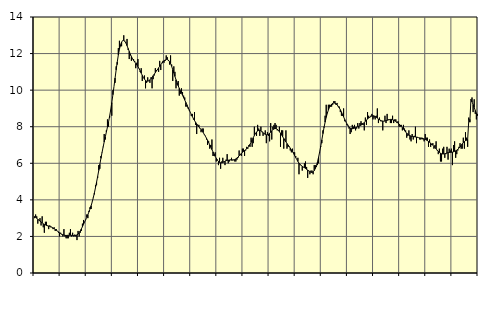
| Category | Piggar | Series 1 |
|---|---|---|
| nan | 3 | 3.09 |
| 87.0 | 3.2 | 3.04 |
| 87.0 | 3.1 | 3 |
| 87.0 | 2.7 | 2.94 |
| 87.0 | 2.9 | 2.89 |
| 87.0 | 3 | 2.84 |
| 87.0 | 2.6 | 2.79 |
| 87.0 | 3.1 | 2.74 |
| 87.0 | 2.5 | 2.69 |
| 87.0 | 2.2 | 2.66 |
| 87.0 | 2.8 | 2.63 |
| 87.0 | 2.8 | 2.6 |
| nan | 2.6 | 2.58 |
| 88.0 | 2.4 | 2.57 |
| 88.0 | 2.6 | 2.55 |
| 88.0 | 2.5 | 2.53 |
| 88.0 | 2.5 | 2.5 |
| 88.0 | 2.4 | 2.46 |
| 88.0 | 2.5 | 2.42 |
| 88.0 | 2.3 | 2.38 |
| 88.0 | 2.4 | 2.33 |
| 88.0 | 2.3 | 2.29 |
| 88.0 | 2.2 | 2.25 |
| 88.0 | 2 | 2.2 |
| nan | 2.2 | 2.16 |
| 89.0 | 2.1 | 2.12 |
| 89.0 | 2 | 2.09 |
| 89.0 | 2.4 | 2.07 |
| 89.0 | 2 | 2.06 |
| 89.0 | 1.9 | 2.05 |
| 89.0 | 1.9 | 2.06 |
| 89.0 | 1.9 | 2.06 |
| 89.0 | 2.2 | 2.06 |
| 89.0 | 2.4 | 2.06 |
| 89.0 | 2 | 2.06 |
| 89.0 | 2.2 | 2.05 |
| nan | 2 | 2.05 |
| 90.0 | 2.1 | 2.04 |
| 90.0 | 2 | 2.06 |
| 90.0 | 1.8 | 2.08 |
| 90.0 | 2.3 | 2.13 |
| 90.0 | 2 | 2.2 |
| 90.0 | 2.2 | 2.3 |
| 90.0 | 2.3 | 2.41 |
| 90.0 | 2.7 | 2.53 |
| 90.0 | 2.9 | 2.66 |
| 90.0 | 2.8 | 2.79 |
| 90.0 | 2.9 | 2.92 |
| nan | 3.2 | 3.05 |
| 91.0 | 3 | 3.19 |
| 91.0 | 3.4 | 3.34 |
| 91.0 | 3.6 | 3.5 |
| 91.0 | 3.5 | 3.68 |
| 91.0 | 3.9 | 3.89 |
| 91.0 | 4.1 | 4.12 |
| 91.0 | 4.3 | 4.38 |
| 91.0 | 4.8 | 4.67 |
| 91.0 | 4.8 | 4.97 |
| 91.0 | 5.2 | 5.28 |
| 91.0 | 5.9 | 5.61 |
| nan | 5.7 | 5.94 |
| 92.0 | 6.4 | 6.27 |
| 92.0 | 6.6 | 6.58 |
| 92.0 | 6.9 | 6.88 |
| 92.0 | 7.6 | 7.17 |
| 92.0 | 7.3 | 7.44 |
| 92.0 | 7.8 | 7.71 |
| 92.0 | 8.4 | 7.98 |
| 92.0 | 8 | 8.26 |
| 92.0 | 8.5 | 8.58 |
| 92.0 | 8.9 | 8.93 |
| 92.0 | 8.6 | 9.32 |
| nan | 10 | 9.75 |
| 93.0 | 10.2 | 10.2 |
| 93.0 | 10.4 | 10.66 |
| 93.0 | 11.3 | 11.11 |
| 93.0 | 11.4 | 11.54 |
| 93.0 | 12.3 | 11.92 |
| 93.0 | 12.7 | 12.23 |
| 93.0 | 12.4 | 12.48 |
| 93.0 | 12.4 | 12.63 |
| 93.0 | 12.7 | 12.71 |
| 93.0 | 13 | 12.72 |
| 93.0 | 12.7 | 12.67 |
| nan | 12.6 | 12.57 |
| 94.0 | 12.8 | 12.43 |
| 94.0 | 12.2 | 12.28 |
| 94.0 | 11.7 | 12.12 |
| 94.0 | 11.9 | 11.97 |
| 94.0 | 11.6 | 11.84 |
| 94.0 | 11.7 | 11.72 |
| 94.0 | 11.7 | 11.62 |
| 94.0 | 11.6 | 11.54 |
| 94.0 | 11.2 | 11.46 |
| 94.0 | 11.5 | 11.38 |
| 94.0 | 11.7 | 11.29 |
| nan | 11.2 | 11.18 |
| 95.0 | 11 | 11.06 |
| 95.0 | 11.2 | 10.93 |
| 95.0 | 10.5 | 10.81 |
| 95.0 | 10.7 | 10.7 |
| 95.0 | 10.8 | 10.6 |
| 95.0 | 10.1 | 10.53 |
| 95.0 | 10.4 | 10.49 |
| 95.0 | 10.7 | 10.49 |
| 95.0 | 10.5 | 10.51 |
| 95.0 | 10.4 | 10.56 |
| 95.0 | 10.7 | 10.62 |
| nan | 10.1 | 10.7 |
| 96.0 | 10.6 | 10.79 |
| 96.0 | 10.8 | 10.87 |
| 96.0 | 11.2 | 10.96 |
| 96.0 | 11.1 | 11.05 |
| 96.0 | 11.1 | 11.13 |
| 96.0 | 11 | 11.22 |
| 96.0 | 11.6 | 11.3 |
| 96.0 | 11.1 | 11.39 |
| 96.0 | 11.5 | 11.47 |
| 96.0 | 11.6 | 11.54 |
| 96.0 | 11.5 | 11.61 |
| nan | 11.6 | 11.65 |
| 97.0 | 11.9 | 11.68 |
| 97.0 | 11.8 | 11.68 |
| 97.0 | 11.6 | 11.64 |
| 97.0 | 11.4 | 11.56 |
| 97.0 | 11.9 | 11.45 |
| 97.0 | 11.4 | 11.3 |
| 97.0 | 10.5 | 11.12 |
| 97.0 | 11.3 | 10.94 |
| 97.0 | 11 | 10.75 |
| 97.0 | 10.1 | 10.57 |
| 97.0 | 10.3 | 10.4 |
| nan | 10.5 | 10.24 |
| 98.0 | 9.7 | 10.1 |
| 98.0 | 9.8 | 9.97 |
| 98.0 | 10.1 | 9.84 |
| 98.0 | 9.9 | 9.72 |
| 98.0 | 9.7 | 9.59 |
| 98.0 | 9.6 | 9.46 |
| 98.0 | 9.1 | 9.33 |
| 98.0 | 9.1 | 9.2 |
| 98.0 | 9 | 9.06 |
| 98.0 | 8.9 | 8.93 |
| 98.0 | 8.8 | 8.8 |
| nan | 8.6 | 8.68 |
| 99.0 | 8.7 | 8.56 |
| 99.0 | 8.4 | 8.44 |
| 99.0 | 8.8 | 8.34 |
| 99.0 | 8.1 | 8.24 |
| 99.0 | 7.6 | 8.15 |
| 99.0 | 8.1 | 8.07 |
| 99.0 | 8.1 | 7.99 |
| 99.0 | 7.9 | 7.92 |
| 99.0 | 7.7 | 7.84 |
| 99.0 | 7.9 | 7.76 |
| 99.0 | 7.9 | 7.68 |
| nan | 7.6 | 7.58 |
| 0.0 | 7.5 | 7.48 |
| 0.0 | 7.3 | 7.37 |
| 0.0 | 7 | 7.26 |
| 0.0 | 7.2 | 7.13 |
| 0.0 | 6.8 | 7.01 |
| 0.0 | 7 | 6.88 |
| 0.0 | 7.3 | 6.75 |
| 0.0 | 6.4 | 6.62 |
| 0.0 | 6.4 | 6.5 |
| 0.0 | 6.6 | 6.38 |
| 0.0 | 6.1 | 6.27 |
| nan | 6.2 | 6.17 |
| 1.0 | 5.9 | 6.1 |
| 1.0 | 6.3 | 6.05 |
| 1.0 | 5.7 | 6.03 |
| 1.0 | 6.1 | 6.03 |
| 1.0 | 6.3 | 6.04 |
| 1.0 | 6.1 | 6.07 |
| 1.0 | 5.9 | 6.1 |
| 1.0 | 6.2 | 6.14 |
| 1.0 | 6.5 | 6.16 |
| 1.0 | 6 | 6.17 |
| 1.0 | 6.1 | 6.18 |
| nan | 6.2 | 6.18 |
| 2.0 | 6.3 | 6.17 |
| 2.0 | 6.2 | 6.17 |
| 2.0 | 6.2 | 6.18 |
| 2.0 | 6.1 | 6.2 |
| 2.0 | 6.1 | 6.24 |
| 2.0 | 6.2 | 6.29 |
| 2.0 | 6.3 | 6.34 |
| 2.0 | 6.7 | 6.41 |
| 2.0 | 6.5 | 6.47 |
| 2.0 | 6.4 | 6.54 |
| 2.0 | 6.8 | 6.59 |
| nan | 6.8 | 6.65 |
| 3.0 | 6.4 | 6.7 |
| 3.0 | 6.7 | 6.74 |
| 3.0 | 6.9 | 6.79 |
| 3.0 | 6.8 | 6.86 |
| 3.0 | 7 | 6.94 |
| 3.0 | 6.9 | 7.04 |
| 3.0 | 7.4 | 7.15 |
| 3.0 | 6.9 | 7.28 |
| 3.0 | 7.1 | 7.4 |
| 3.0 | 8 | 7.52 |
| 3.0 | 7.6 | 7.63 |
| nan | 7.5 | 7.71 |
| 4.0 | 8.1 | 7.77 |
| 4.0 | 7.9 | 7.8 |
| 4.0 | 7.5 | 7.8 |
| 4.0 | 8 | 7.78 |
| 4.0 | 7.7 | 7.73 |
| 4.0 | 7.5 | 7.68 |
| 4.0 | 7.6 | 7.62 |
| 4.0 | 7.8 | 7.58 |
| 4.0 | 7.1 | 7.56 |
| 4.0 | 7.7 | 7.56 |
| 4.0 | 7.5 | 7.59 |
| nan | 7.2 | 7.64 |
| 5.0 | 8.2 | 7.7 |
| 5.0 | 7.3 | 7.77 |
| 5.0 | 8 | 7.84 |
| 5.0 | 8.1 | 7.88 |
| 5.0 | 8.2 | 7.9 |
| 5.0 | 8.1 | 7.9 |
| 5.0 | 7.8 | 7.86 |
| 5.0 | 7.8 | 7.81 |
| 5.0 | 8 | 7.73 |
| 5.0 | 6.9 | 7.64 |
| 5.0 | 7.8 | 7.55 |
| nan | 7.8 | 7.45 |
| 6.0 | 6.8 | 7.36 |
| 6.0 | 7.3 | 7.26 |
| 6.0 | 7.8 | 7.17 |
| 6.0 | 6.8 | 7.08 |
| 6.0 | 6.9 | 7 |
| 6.0 | 6.9 | 6.92 |
| 6.0 | 6.7 | 6.83 |
| 6.0 | 6.6 | 6.74 |
| 6.0 | 6.8 | 6.64 |
| 6.0 | 6.6 | 6.54 |
| 6.0 | 6.6 | 6.42 |
| nan | 6.4 | 6.31 |
| 7.0 | 6.2 | 6.2 |
| 7.0 | 6.3 | 6.1 |
| 7.0 | 5.4 | 6.01 |
| 7.0 | 5.9 | 5.94 |
| 7.0 | 5.9 | 5.88 |
| 7.0 | 5.6 | 5.83 |
| 7.0 | 5.8 | 5.79 |
| 7.0 | 6 | 5.76 |
| 7.0 | 6.1 | 5.72 |
| 7.0 | 5.8 | 5.67 |
| 7.0 | 5.2 | 5.63 |
| nan | 5.6 | 5.58 |
| 8.0 | 5.4 | 5.54 |
| 8.0 | 5.6 | 5.51 |
| 8.0 | 5.6 | 5.5 |
| 8.0 | 5.4 | 5.53 |
| 8.0 | 5.9 | 5.6 |
| 8.0 | 5.9 | 5.71 |
| 8.0 | 5.8 | 5.87 |
| 8.0 | 5.9 | 6.08 |
| 8.0 | 6 | 6.33 |
| 8.0 | 6.6 | 6.62 |
| 8.0 | 6.9 | 6.94 |
| nan | 7.1 | 7.28 |
| 9.0 | 7.8 | 7.62 |
| 9.0 | 8 | 7.95 |
| 9.0 | 8.6 | 8.25 |
| 9.0 | 9.2 | 8.51 |
| 9.0 | 8.8 | 8.73 |
| 9.0 | 9.2 | 8.91 |
| 9.0 | 9.2 | 9.06 |
| 9.0 | 9.1 | 9.16 |
| 9.0 | 9.1 | 9.24 |
| 9.0 | 9.2 | 9.28 |
| 9.0 | 9.4 | 9.3 |
| nan | 9.4 | 9.29 |
| 10.0 | 9.2 | 9.25 |
| 10.0 | 9.3 | 9.2 |
| 10.0 | 9.1 | 9.12 |
| 10.0 | 9.1 | 9.03 |
| 10.0 | 8.8 | 8.93 |
| 10.0 | 8.6 | 8.81 |
| 10.0 | 8.6 | 8.67 |
| 10.0 | 9 | 8.54 |
| 10.0 | 8.3 | 8.4 |
| 10.0 | 8.3 | 8.28 |
| 10.0 | 8.1 | 8.16 |
| nan | 8.1 | 8.06 |
| 11.0 | 7.9 | 7.98 |
| 11.0 | 7.6 | 7.93 |
| 11.0 | 7.7 | 7.9 |
| 11.0 | 8.1 | 7.89 |
| 11.0 | 8 | 7.9 |
| 11.0 | 8.1 | 7.92 |
| 11.0 | 7.8 | 7.95 |
| 11.0 | 7.9 | 7.98 |
| 11.0 | 8.2 | 8.01 |
| 11.0 | 7.9 | 8.03 |
| 11.0 | 8.2 | 8.06 |
| nan | 8.3 | 8.09 |
| 12.0 | 8.2 | 8.12 |
| 12.0 | 8.1 | 8.17 |
| 12.0 | 7.8 | 8.23 |
| 12.0 | 8.5 | 8.3 |
| 12.0 | 8.1 | 8.36 |
| 12.0 | 8.8 | 8.42 |
| 12.0 | 8.6 | 8.48 |
| 12.0 | 8.5 | 8.52 |
| 12.0 | 8.6 | 8.56 |
| 12.0 | 8.7 | 8.59 |
| 12.0 | 8.4 | 8.6 |
| nan | 8.5 | 8.59 |
| 13.0 | 8.4 | 8.56 |
| 13.0 | 8.6 | 8.52 |
| 13.0 | 9 | 8.47 |
| 13.0 | 8.2 | 8.42 |
| 13.0 | 8.5 | 8.38 |
| 13.0 | 8.3 | 8.35 |
| 13.0 | 8.3 | 8.32 |
| 13.0 | 7.8 | 8.31 |
| 13.0 | 8.3 | 8.3 |
| 13.0 | 8.6 | 8.31 |
| 13.0 | 8.2 | 8.33 |
| nan | 8.7 | 8.35 |
| 14.0 | 8.4 | 8.37 |
| 14.0 | 8.4 | 8.39 |
| 14.0 | 8.2 | 8.4 |
| 14.0 | 8.2 | 8.4 |
| 14.0 | 8.6 | 8.38 |
| 14.0 | 8.2 | 8.36 |
| 14.0 | 8.4 | 8.32 |
| 14.0 | 8.4 | 8.29 |
| 14.0 | 8.2 | 8.25 |
| 14.0 | 8.3 | 8.2 |
| 14.0 | 8 | 8.15 |
| nan | 8 | 8.09 |
| 15.0 | 8.1 | 8.02 |
| 15.0 | 7.8 | 7.95 |
| 15.0 | 8.1 | 7.87 |
| 15.0 | 7.9 | 7.79 |
| 15.0 | 7.8 | 7.71 |
| 15.0 | 7.4 | 7.65 |
| 15.0 | 7.5 | 7.59 |
| 15.0 | 7.8 | 7.54 |
| 15.0 | 7.3 | 7.51 |
| 15.0 | 7.2 | 7.48 |
| 15.0 | 7.6 | 7.47 |
| nan | 7.3 | 7.46 |
| 16.0 | 7.5 | 7.45 |
| 16.0 | 8 | 7.44 |
| 16.0 | 7.1 | 7.43 |
| 16.0 | 7.4 | 7.42 |
| 16.0 | 7.4 | 7.4 |
| 16.0 | 7.3 | 7.39 |
| 16.0 | 7.3 | 7.38 |
| 16.0 | 7.4 | 7.36 |
| 16.0 | 7.3 | 7.35 |
| 16.0 | 7.2 | 7.33 |
| 16.0 | 7.6 | 7.31 |
| nan | 7.4 | 7.27 |
| 17.0 | 7.4 | 7.24 |
| 17.0 | 6.9 | 7.19 |
| 17.0 | 7.3 | 7.15 |
| 17.0 | 6.9 | 7.1 |
| 17.0 | 7 | 7.05 |
| 17.0 | 7.1 | 6.99 |
| 17.0 | 6.8 | 6.93 |
| 17.0 | 7 | 6.86 |
| 17.0 | 7.2 | 6.79 |
| 17.0 | 6.7 | 6.72 |
| 17.0 | 6.5 | 6.66 |
| nan | 6.8 | 6.6 |
| 18.0 | 6.1 | 6.55 |
| 18.0 | 6.1 | 6.52 |
| 18.0 | 6.8 | 6.51 |
| 18.0 | 6.9 | 6.51 |
| 18.0 | 6.3 | 6.52 |
| 18.0 | 6.5 | 6.54 |
| 18.0 | 6.9 | 6.56 |
| 18.0 | 6.2 | 6.58 |
| 18.0 | 6.8 | 6.59 |
| 18.0 | 6.7 | 6.6 |
| 18.0 | 6.8 | 6.6 |
| nan | 5.9 | 6.61 |
| 19.0 | 7 | 6.63 |
| 19.0 | 7.2 | 6.65 |
| 19.0 | 6.3 | 6.68 |
| 19.0 | 6.5 | 6.72 |
| 19.0 | 6.7 | 6.77 |
| 19.0 | 6.9 | 6.83 |
| 19.0 | 7.1 | 6.9 |
| 19.0 | 6.8 | 6.98 |
| 19.0 | 6.8 | 7.06 |
| 19.0 | 7.4 | 7.13 |
| 19.0 | 6.8 | 7.19 |
| nan | 7.7 | 7.24 |
| 20.0 | 7.4 | 7.26 |
| 20.0 | 6.9 | 7.31 |
| 20.0 | 8.5 | 8.33 |
| 20.0 | 8.4 | 8.25 |
| 20.0 | 9.5 | 9.49 |
| 20.0 | 9.6 | 9.36 |
| 20.0 | 8.8 | 9.21 |
| 20.0 | 9.5 | 9.05 |
| 20.0 | 8.7 | 8.89 |
| 20.0 | 8.4 | 8.74 |
| 20.0 | 8.7 | 8.6 |